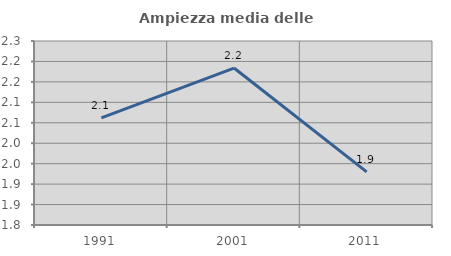
| Category | Ampiezza media delle famiglie |
|---|---|
| 1991.0 | 2.062 |
| 2001.0 | 2.184 |
| 2011.0 | 1.93 |